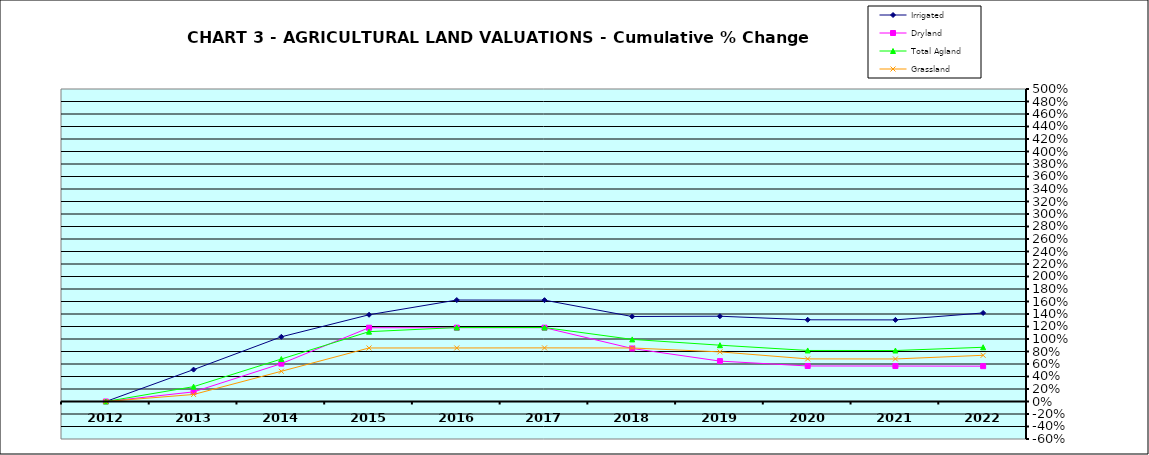
| Category | Irrigated | Dryland | Total Agland | Grassland |
|---|---|---|---|---|
| 2012.0 | 0 | 0 | 0 | 0 |
| 2013.0 | 0.51 | 0.154 | 0.238 | 0.112 |
| 2014.0 | 1.035 | 0.606 | 0.68 | 0.483 |
| 2015.0 | 1.388 | 1.18 | 1.117 | 0.856 |
| 2016.0 | 1.623 | 1.181 | 1.183 | 0.857 |
| 2017.0 | 1.622 | 1.181 | 1.183 | 0.858 |
| 2018.0 | 1.36 | 0.848 | 0.994 | 0.856 |
| 2019.0 | 1.364 | 0.646 | 0.901 | 0.794 |
| 2020.0 | 1.307 | 0.568 | 0.817 | 0.682 |
| 2021.0 | 1.306 | 0.567 | 0.816 | 0.681 |
| 2022.0 | 1.417 | 0.565 | 0.868 | 0.739 |